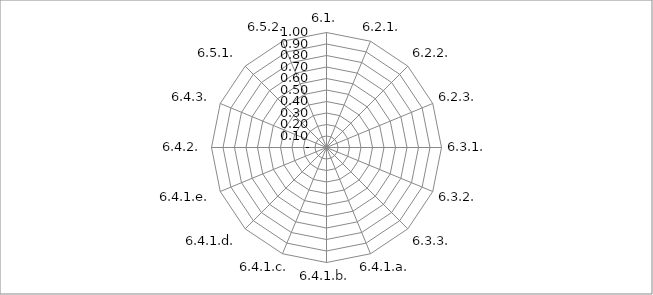
| Category | Series 0 |
|---|---|
| 6.1. | 0 |
| 6.2.1. | 0 |
| 6.2.2. | 0 |
| 6.2.3. | 0 |
| 6.3.1. | 0 |
| 6.3.2. | 0 |
| 6.3.3. | 0 |
| 6.4.1.a. | 0 |
| 6.4.1.b. | 0 |
| 6.4.1.c. | 0 |
| 6.4.1.d. | 0 |
| 6.4.1.e. | 0 |
| 6.4.2. | 0 |
| 6.4.3. | 0 |
| 6.5.1. | 0 |
| 6.5.2. | 0 |